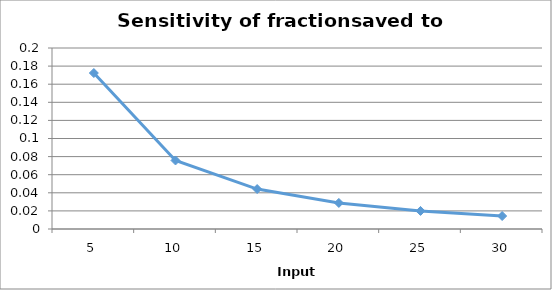
| Category | Series 0 |
|---|---|
| 5.0 | 0.172 |
| 10.0 | 0.076 |
| 15.0 | 0.044 |
| 20.0 | 0.029 |
| 25.0 | 0.02 |
| 30.0 | 0.014 |